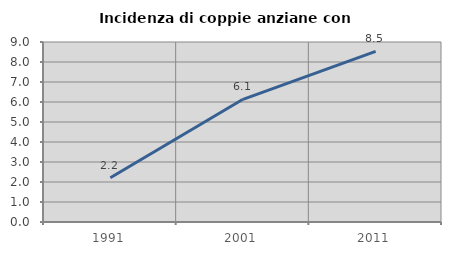
| Category | Incidenza di coppie anziane con figli |
|---|---|
| 1991.0 | 2.21 |
| 2001.0 | 6.135 |
| 2011.0 | 8.527 |